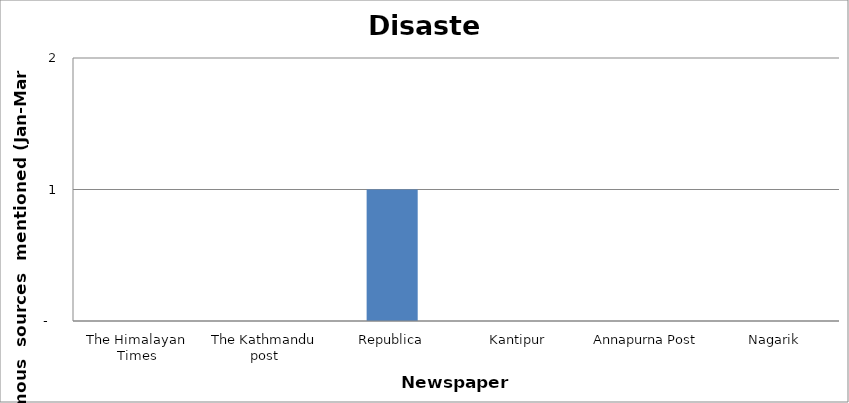
| Category | Disaster |
|---|---|
| The Himalayan Times | 0 |
| The Kathmandu post | 0 |
| Republica | 1 |
| Kantipur | 0 |
| Annapurna Post | 0 |
| Nagarik | 0 |